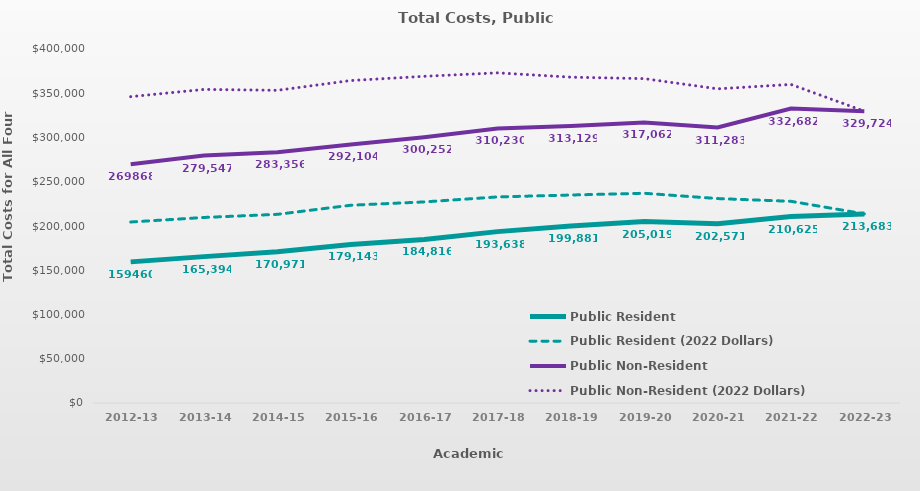
| Category | Public Resident | Public Resident (2022 Dollars) | Public Non-Resident | Public Non-Resident (2022 Dollars) |
|---|---|---|---|---|
| 2012-13 | 159460 | 204528.37 | 269868 | 346141.115 |
| 2013-14 | 165394 | 209651.178 | 279547 | 354349.964 |
| 2014-15 | 170971 | 213187.677 | 283356 | 353323.122 |
| 2015-16 | 179142.68 | 223461.925 | 292103.97 | 364369.426 |
| 2016-17 | 184815.95 | 227210.327 | 300252.49 | 369126.509 |
| 2017-18 | 193638.08 | 232854.908 | 310229.56 | 373059.243 |
| 2018-19 | 199881.23 | 235013.047 | 313129.36 | 368166.06 |
| 2019-20 | 205019.28 | 236996.379 | 317062.1 | 366514.65 |
| 2020-21 | 202571.38 | 231002.22 | 311282.77 | 354971.226 |
| 2021-22 | 210625.46 | 227898.206 | 332681.97 | 359964.195 |
| 2022-23 | 213683.21 | 213683.21 | 329724.26 | 329724.26 |